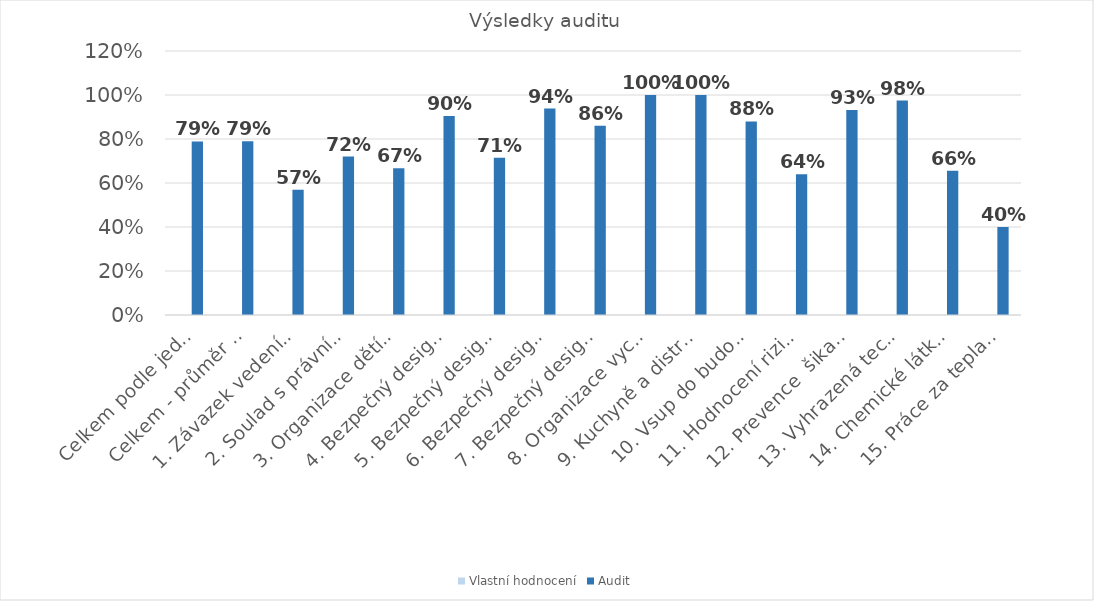
| Category | Vlastní hodnocení | Audit |
|---|---|---|
| Celkem podle jednotlivých otázek | 0 | 0.789 |
| Celkem - průměr skupin | 0 | 0.79 |
| 1. Závazek vedení a systém řízení BOZP | 0 | 0.569 |
| 2. Soulad s právními předpisy - celkem | 0 | 0.72 |
| 3. Organizace dětí a práce - celkem | 0 | 0.667 |
| 4. Bezpečný design budova - celkem | 0 | 0.904 |
| 5. Bezpečný design nábytek a vnitřní vybavení - celkem | 0 | 0.714 |
| 6. Bezpečný design hračky a pomůcky - celkem | 0 | 0.938 |
| 7. Bezpečný design zahrada/ venkovní areál - celkem | 0 | 0.86 |
| 8. Organizace vycházek - celkem | 0 | 1 |
| 9. Kuchyně a distribuce pokrmů - celkem | 0 | 1 |
| 10. Vsup do budovy/security - celkem | 0 | 0.88 |
| 11. Hodnocení rizik - celekm | 0 | 0.64 |
| 12. Prevence  šikany | 0 | 0.932 |
| 13. Vyhrazená technická zařízení   - celkem | 0 | 0.975 |
| 14. Chemické látky - celkem | 0 | 0.656 |
| 15. Práce za tepla  - celkem | 0 | 0.4 |